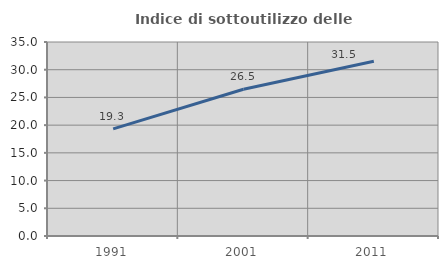
| Category | Indice di sottoutilizzo delle abitazioni  |
|---|---|
| 1991.0 | 19.317 |
| 2001.0 | 26.465 |
| 2011.0 | 31.514 |